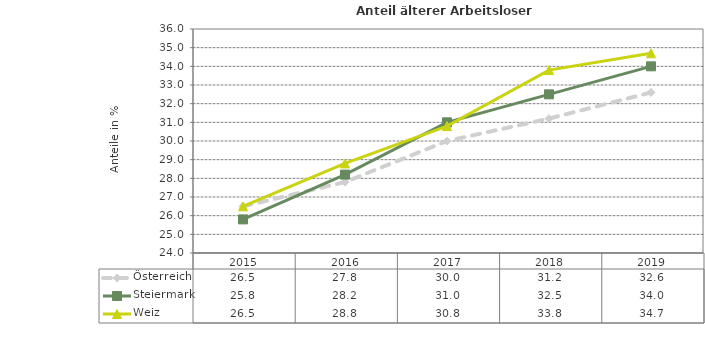
| Category | Österreich | Steiermark | Weiz |
|---|---|---|---|
| 2019.0 | 32.6 | 34 | 34.7 |
| 2018.0 | 31.2 | 32.5 | 33.8 |
| 2017.0 | 30 | 31 | 30.8 |
| 2016.0 | 27.8 | 28.2 | 28.8 |
| 2015.0 | 26.5 | 25.8 | 26.5 |